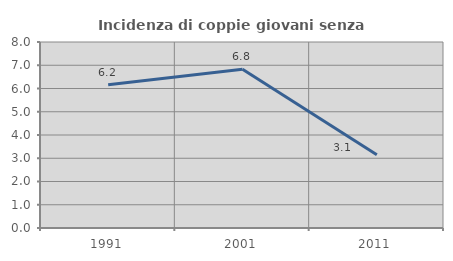
| Category | Incidenza di coppie giovani senza figli |
|---|---|
| 1991.0 | 6.161 |
| 2001.0 | 6.827 |
| 2011.0 | 3.147 |